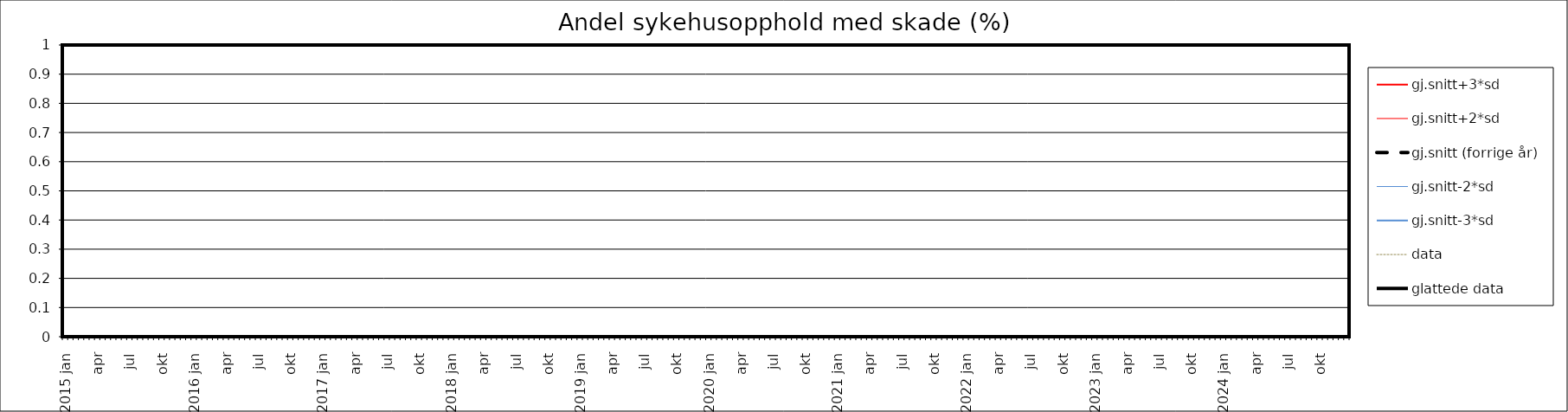
| Category | gj.snitt+3*sd | gj.snitt+2*sd | gj.snitt (forrige år) | gj.snitt-2*sd | gj.snitt-3*sd | data | glattede data |
|---|---|---|---|---|---|---|---|
| 2015 jan | 0 | 0 | 0 | 0 | 0 | 0 | 0 |
|  | 0 | 0 | 0 | 0 | 0 | 0 | 0 |
| feb | 0 | 0 | 0 | 0 | 0 | 0 | 0 |
|  | 0 | 0 | 0 | 0 | 0 | 0 | 0 |
| mar | 0 | 0 | 0 | 0 | 0 | 0 | 0 |
|  | 0 | 0 | 0 | 0 | 0 | 0 | 0 |
| apr | 0 | 0 | 0 | 0 | 0 | 0 | 0 |
|  | 0 | 0 | 0 | 0 | 0 | 0 | 0 |
| mai | 0 | 0 | 0 | 0 | 0 | 0 | 0 |
|  | 0 | 0 | 0 | 0 | 0 | 0 | 0 |
| jun | 0 | 0 | 0 | 0 | 0 | 0 | 0 |
|  | 0 | 0 | 0 | 0 | 0 | 0 | 0 |
| jul | 0 | 0 | 0 | 0 | 0 | 0 | 0 |
|  | 0 | 0 | 0 | 0 | 0 | 0 | 0 |
| aug | 0 | 0 | 0 | 0 | 0 | 0 | 0 |
|  | 0 | 0 | 0 | 0 | 0 | 0 | 0 |
| sep | 0 | 0 | 0 | 0 | 0 | 0 | 0 |
|  | 0 | 0 | 0 | 0 | 0 | 0 | 0 |
| okt | 0 | 0 | 0 | 0 | 0 | 0 | 0 |
|  | 0 | 0 | 0 | 0 | 0 | 0 | 0 |
| nov | 0 | 0 | 0 | 0 | 0 | 0 | 0 |
|  | 0 | 0 | 0 | 0 | 0 | 0 | 0 |
| des | 0 | 0 | 0 | 0 | 0 | 0 | 0 |
|  | 0 | 0 | 0 | 0 | 0 | 0 | 0 |
| 2016 jan | 0 | 0 | 0 | 0 | 0 | 0 | 0 |
|  | 0 | 0 | 0 | 0 | 0 | 0 | 0 |
| feb | 0 | 0 | 0 | 0 | 0 | 0 | 0 |
|  | 0 | 0 | 0 | 0 | 0 | 0 | 0 |
| mar | 0 | 0 | 0 | 0 | 0 | 0 | 0 |
|  | 0 | 0 | 0 | 0 | 0 | 0 | 0 |
| apr | 0 | 0 | 0 | 0 | 0 | 0 | 0 |
|  | 0 | 0 | 0 | 0 | 0 | 0 | 0 |
| mai | 0 | 0 | 0 | 0 | 0 | 0 | 0 |
|  | 0 | 0 | 0 | 0 | 0 | 0 | 0 |
| jun | 0 | 0 | 0 | 0 | 0 | 0 | 0 |
|  | 0 | 0 | 0 | 0 | 0 | 0 | 0 |
| jul | 0 | 0 | 0 | 0 | 0 | 0 | 0 |
|  | 0 | 0 | 0 | 0 | 0 | 0 | 0 |
| aug | 0 | 0 | 0 | 0 | 0 | 0 | 0 |
|  | 0 | 0 | 0 | 0 | 0 | 0 | 0 |
| sep | 0 | 0 | 0 | 0 | 0 | 0 | 0 |
|  | 0 | 0 | 0 | 0 | 0 | 0 | 0 |
| okt | 0 | 0 | 0 | 0 | 0 | 0 | 0 |
|  | 0 | 0 | 0 | 0 | 0 | 0 | 0 |
| nov | 0 | 0 | 0 | 0 | 0 | 0 | 0 |
|  | 0 | 0 | 0 | 0 | 0 | 0 | 0 |
| des | 0 | 0 | 0 | 0 | 0 | 0 | 0 |
|  | 0 | 0 | 0 | 0 | 0 | 0 | 0 |
| 2017 jan | 0 | 0 | 0 | 0 | 0 | 0 | 0 |
|  | 0 | 0 | 0 | 0 | 0 | 0 | 0 |
| feb | 0 | 0 | 0 | 0 | 0 | 0 | 0 |
|  | 0 | 0 | 0 | 0 | 0 | 0 | 0 |
| mar | 0 | 0 | 0 | 0 | 0 | 0 | 0 |
|  | 0 | 0 | 0 | 0 | 0 | 0 | 0 |
| apr | 0 | 0 | 0 | 0 | 0 | 0 | 0 |
|  | 0 | 0 | 0 | 0 | 0 | 0 | 0 |
| mai | 0 | 0 | 0 | 0 | 0 | 0 | 0 |
|  | 0 | 0 | 0 | 0 | 0 | 0 | 0 |
| jun | 0 | 0 | 0 | 0 | 0 | 0 | 0 |
|  | 0 | 0 | 0 | 0 | 0 | 0 | 0 |
| jul | 0 | 0 | 0 | 0 | 0 | 0 | 0 |
|  | 0 | 0 | 0 | 0 | 0 | 0 | 0 |
| aug | 0 | 0 | 0 | 0 | 0 | 0 | 0 |
|  | 0 | 0 | 0 | 0 | 0 | 0 | 0 |
| sep | 0 | 0 | 0 | 0 | 0 | 0 | 0 |
|  | 0 | 0 | 0 | 0 | 0 | 0 | 0 |
| okt | 0 | 0 | 0 | 0 | 0 | 0 | 0 |
|  | 0 | 0 | 0 | 0 | 0 | 0 | 0 |
| nov | 0 | 0 | 0 | 0 | 0 | 0 | 0 |
|  | 0 | 0 | 0 | 0 | 0 | 0 | 0 |
| des | 0 | 0 | 0 | 0 | 0 | 0 | 0 |
|  | 0 | 0 | 0 | 0 | 0 | 0 | 0 |
| 2018 jan | 0 | 0 | 0 | 0 | 0 | 0 | 0 |
|  | 0 | 0 | 0 | 0 | 0 | 0 | 0 |
| feb | 0 | 0 | 0 | 0 | 0 | 0 | 0 |
|  | 0 | 0 | 0 | 0 | 0 | 0 | 0 |
| mar | 0 | 0 | 0 | 0 | 0 | 0 | 0 |
|  | 0 | 0 | 0 | 0 | 0 | 0 | 0 |
| apr | 0 | 0 | 0 | 0 | 0 | 0 | 0 |
|  | 0 | 0 | 0 | 0 | 0 | 0 | 0 |
| mai | 0 | 0 | 0 | 0 | 0 | 0 | 0 |
|  | 0 | 0 | 0 | 0 | 0 | 0 | 0 |
| jun | 0 | 0 | 0 | 0 | 0 | 0 | 0 |
|  | 0 | 0 | 0 | 0 | 0 | 0 | 0 |
| jul | 0 | 0 | 0 | 0 | 0 | 0 | 0 |
|  | 0 | 0 | 0 | 0 | 0 | 0 | 0 |
| aug | 0 | 0 | 0 | 0 | 0 | 0 | 0 |
|  | 0 | 0 | 0 | 0 | 0 | 0 | 0 |
| sep | 0 | 0 | 0 | 0 | 0 | 0 | 0 |
|  | 0 | 0 | 0 | 0 | 0 | 0 | 0 |
| okt | 0 | 0 | 0 | 0 | 0 | 0 | 0 |
|  | 0 | 0 | 0 | 0 | 0 | 0 | 0 |
| nov | 0 | 0 | 0 | 0 | 0 | 0 | 0 |
|  | 0 | 0 | 0 | 0 | 0 | 0 | 0 |
| des | 0 | 0 | 0 | 0 | 0 | 0 | 0 |
|  | 0 | 0 | 0 | 0 | 0 | 0 | 0 |
| 2019 jan | 0 | 0 | 0 | 0 | 0 | 0 | 0 |
|  | 0 | 0 | 0 | 0 | 0 | 0 | 0 |
| feb | 0 | 0 | 0 | 0 | 0 | 0 | 0 |
|  | 0 | 0 | 0 | 0 | 0 | 0 | 0 |
| mar | 0 | 0 | 0 | 0 | 0 | 0 | 0 |
|  | 0 | 0 | 0 | 0 | 0 | 0 | 0 |
| apr | 0 | 0 | 0 | 0 | 0 | 0 | 0 |
|  | 0 | 0 | 0 | 0 | 0 | 0 | 0 |
| mai | 0 | 0 | 0 | 0 | 0 | 0 | 0 |
|  | 0 | 0 | 0 | 0 | 0 | 0 | 0 |
| jun | 0 | 0 | 0 | 0 | 0 | 0 | 0 |
|  | 0 | 0 | 0 | 0 | 0 | 0 | 0 |
| jul | 0 | 0 | 0 | 0 | 0 | 0 | 0 |
|  | 0 | 0 | 0 | 0 | 0 | 0 | 0 |
| aug | 0 | 0 | 0 | 0 | 0 | 0 | 0 |
|  | 0 | 0 | 0 | 0 | 0 | 0 | 0 |
| sep | 0 | 0 | 0 | 0 | 0 | 0 | 0 |
|  | 0 | 0 | 0 | 0 | 0 | 0 | 0 |
| okt | 0 | 0 | 0 | 0 | 0 | 0 | 0 |
|  | 0 | 0 | 0 | 0 | 0 | 0 | 0 |
| nov | 0 | 0 | 0 | 0 | 0 | 0 | 0 |
|  | 0 | 0 | 0 | 0 | 0 | 0 | 0 |
| des | 0 | 0 | 0 | 0 | 0 | 0 | 0 |
|  | 0 | 0 | 0 | 0 | 0 | 0 | 0 |
| 2020 jan | 0 | 0 | 0 | 0 | 0 | 0 | 0 |
|  | 0 | 0 | 0 | 0 | 0 | 0 | 0 |
| feb | 0 | 0 | 0 | 0 | 0 | 0 | 0 |
|  | 0 | 0 | 0 | 0 | 0 | 0 | 0 |
| mar | 0 | 0 | 0 | 0 | 0 | 0 | 0 |
|  | 0 | 0 | 0 | 0 | 0 | 0 | 0 |
| apr | 0 | 0 | 0 | 0 | 0 | 0 | 0 |
|  | 0 | 0 | 0 | 0 | 0 | 0 | 0 |
| mai | 0 | 0 | 0 | 0 | 0 | 0 | 0 |
|  | 0 | 0 | 0 | 0 | 0 | 0 | 0 |
| jun | 0 | 0 | 0 | 0 | 0 | 0 | 0 |
|  | 0 | 0 | 0 | 0 | 0 | 0 | 0 |
| jul | 0 | 0 | 0 | 0 | 0 | 0 | 0 |
|  | 0 | 0 | 0 | 0 | 0 | 0 | 0 |
| aug | 0 | 0 | 0 | 0 | 0 | 0 | 0 |
|  | 0 | 0 | 0 | 0 | 0 | 0 | 0 |
| sep | 0 | 0 | 0 | 0 | 0 | 0 | 0 |
|  | 0 | 0 | 0 | 0 | 0 | 0 | 0 |
| okt | 0 | 0 | 0 | 0 | 0 | 0 | 0 |
|  | 0 | 0 | 0 | 0 | 0 | 0 | 0 |
| nov | 0 | 0 | 0 | 0 | 0 | 0 | 0 |
|  | 0 | 0 | 0 | 0 | 0 | 0 | 0 |
| des | 0 | 0 | 0 | 0 | 0 | 0 | 0 |
|  | 0 | 0 | 0 | 0 | 0 | 0 | 0 |
| 2021 jan | 0 | 0 | 0 | 0 | 0 | 0 | 0 |
|  | 0 | 0 | 0 | 0 | 0 | 0 | 0 |
| feb | 0 | 0 | 0 | 0 | 0 | 0 | 0 |
|  | 0 | 0 | 0 | 0 | 0 | 0 | 0 |
| mar | 0 | 0 | 0 | 0 | 0 | 0 | 0 |
|  | 0 | 0 | 0 | 0 | 0 | 0 | 0 |
| apr | 0 | 0 | 0 | 0 | 0 | 0 | 0 |
|  | 0 | 0 | 0 | 0 | 0 | 0 | 0 |
| mai | 0 | 0 | 0 | 0 | 0 | 0 | 0 |
|  | 0 | 0 | 0 | 0 | 0 | 0 | 0 |
| jun | 0 | 0 | 0 | 0 | 0 | 0 | 0 |
|  | 0 | 0 | 0 | 0 | 0 | 0 | 0 |
| jul | 0 | 0 | 0 | 0 | 0 | 0 | 0 |
|  | 0 | 0 | 0 | 0 | 0 | 0 | 0 |
| aug | 0 | 0 | 0 | 0 | 0 | 0 | 0 |
|  | 0 | 0 | 0 | 0 | 0 | 0 | 0 |
| sep | 0 | 0 | 0 | 0 | 0 | 0 | 0 |
|  | 0 | 0 | 0 | 0 | 0 | 0 | 0 |
| okt | 0 | 0 | 0 | 0 | 0 | 0 | 0 |
|  | 0 | 0 | 0 | 0 | 0 | 0 | 0 |
| nov | 0 | 0 | 0 | 0 | 0 | 0 | 0 |
|  | 0 | 0 | 0 | 0 | 0 | 0 | 0 |
| des | 0 | 0 | 0 | 0 | 0 | 0 | 0 |
|  | 0 | 0 | 0 | 0 | 0 | 0 | 0 |
| 2022 jan | 0 | 0 | 0 | 0 | 0 | 0 | 0 |
|  | 0 | 0 | 0 | 0 | 0 | 0 | 0 |
| feb | 0 | 0 | 0 | 0 | 0 | 0 | 0 |
|  | 0 | 0 | 0 | 0 | 0 | 0 | 0 |
| mar | 0 | 0 | 0 | 0 | 0 | 0 | 0 |
|  | 0 | 0 | 0 | 0 | 0 | 0 | 0 |
| apr | 0 | 0 | 0 | 0 | 0 | 0 | 0 |
|  | 0 | 0 | 0 | 0 | 0 | 0 | 0 |
| mai | 0 | 0 | 0 | 0 | 0 | 0 | 0 |
|  | 0 | 0 | 0 | 0 | 0 | 0 | 0 |
| jun | 0 | 0 | 0 | 0 | 0 | 0 | 0 |
|  | 0 | 0 | 0 | 0 | 0 | 0 | 0 |
| jul | 0 | 0 | 0 | 0 | 0 | 0 | 0 |
|  | 0 | 0 | 0 | 0 | 0 | 0 | 0 |
| aug | 0 | 0 | 0 | 0 | 0 | 0 | 0 |
|  | 0 | 0 | 0 | 0 | 0 | 0 | 0 |
| sep | 0 | 0 | 0 | 0 | 0 | 0 | 0 |
|  | 0 | 0 | 0 | 0 | 0 | 0 | 0 |
| okt | 0 | 0 | 0 | 0 | 0 | 0 | 0 |
|  | 0 | 0 | 0 | 0 | 0 | 0 | 0 |
| nov | 0 | 0 | 0 | 0 | 0 | 0 | 0 |
|  | 0 | 0 | 0 | 0 | 0 | 0 | 0 |
| des | 0 | 0 | 0 | 0 | 0 | 0 | 0 |
|  | 0 | 0 | 0 | 0 | 0 | 0 | 0 |
| 2023 jan | 0 | 0 | 0 | 0 | 0 | 0 | 0 |
|  | 0 | 0 | 0 | 0 | 0 | 0 | 0 |
| feb | 0 | 0 | 0 | 0 | 0 | 0 | 0 |
|  | 0 | 0 | 0 | 0 | 0 | 0 | 0 |
| mar | 0 | 0 | 0 | 0 | 0 | 0 | 0 |
|  | 0 | 0 | 0 | 0 | 0 | 0 | 0 |
| apr | 0 | 0 | 0 | 0 | 0 | 0 | 0 |
|  | 0 | 0 | 0 | 0 | 0 | 0 | 0 |
| mai | 0 | 0 | 0 | 0 | 0 | 0 | 0 |
|  | 0 | 0 | 0 | 0 | 0 | 0 | 0 |
| jun | 0 | 0 | 0 | 0 | 0 | 0 | 0 |
|  | 0 | 0 | 0 | 0 | 0 | 0 | 0 |
| jul | 0 | 0 | 0 | 0 | 0 | 0 | 0 |
|  | 0 | 0 | 0 | 0 | 0 | 0 | 0 |
| aug | 0 | 0 | 0 | 0 | 0 | 0 | 0 |
|  | 0 | 0 | 0 | 0 | 0 | 0 | 0 |
| sep | 0 | 0 | 0 | 0 | 0 | 0 | 0 |
|  | 0 | 0 | 0 | 0 | 0 | 0 | 0 |
| okt | 0 | 0 | 0 | 0 | 0 | 0 | 0 |
|  | 0 | 0 | 0 | 0 | 0 | 0 | 0 |
| nov | 0 | 0 | 0 | 0 | 0 | 0 | 0 |
|  | 0 | 0 | 0 | 0 | 0 | 0 | 0 |
| des | 0 | 0 | 0 | 0 | 0 | 0 | 0 |
|  | 0 | 0 | 0 | 0 | 0 | 0 | 0 |
| 2024 jan | 0 | 0 | 0 | 0 | 0 | 0 | 0 |
|  | 0 | 0 | 0 | 0 | 0 | 0 | 0 |
| feb | 0 | 0 | 0 | 0 | 0 | 0 | 0 |
|  | 0 | 0 | 0 | 0 | 0 | 0 | 0 |
| mar | 0 | 0 | 0 | 0 | 0 | 0 | 0 |
|  | 0 | 0 | 0 | 0 | 0 | 0 | 0 |
| apr | 0 | 0 | 0 | 0 | 0 | 0 | 0 |
|  | 0 | 0 | 0 | 0 | 0 | 0 | 0 |
| mai | 0 | 0 | 0 | 0 | 0 | 0 | 0 |
|  | 0 | 0 | 0 | 0 | 0 | 0 | 0 |
| jun | 0 | 0 | 0 | 0 | 0 | 0 | 0 |
|  | 0 | 0 | 0 | 0 | 0 | 0 | 0 |
| jul | 0 | 0 | 0 | 0 | 0 | 0 | 0 |
|  | 0 | 0 | 0 | 0 | 0 | 0 | 0 |
| aug | 0 | 0 | 0 | 0 | 0 | 0 | 0 |
|  | 0 | 0 | 0 | 0 | 0 | 0 | 0 |
| sep | 0 | 0 | 0 | 0 | 0 | 0 | 0 |
|  | 0 | 0 | 0 | 0 | 0 | 0 | 0 |
| okt | 0 | 0 | 0 | 0 | 0 | 0 | 0 |
|  | 0 | 0 | 0 | 0 | 0 | 0 | 0 |
| nov | 0 | 0 | 0 | 0 | 0 | 0 | 0 |
|  | 0 | 0 | 0 | 0 | 0 | 0 | 0 |
| des | 0 | 0 | 0 | 0 | 0 | 0 | 0 |